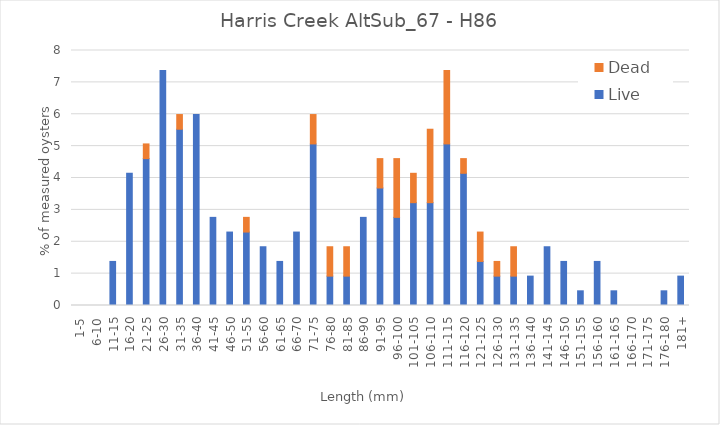
| Category | Live | Dead |
|---|---|---|
| 1-5 | 0 | 0 |
| 6-10 | 0 | 0 |
| 11-15 | 1.382 | 0 |
| 16-20 | 4.147 | 0 |
| 21-25 | 4.608 | 0.461 |
| 26-30 | 7.373 | 0 |
| 31-35 | 5.53 | 0.461 |
| 36-40 | 5.991 | 0 |
| 41-45 | 2.765 | 0 |
| 46-50 | 2.304 | 0 |
| 51-55 | 2.304 | 0.461 |
| 56-60 | 1.843 | 0 |
| 61-65 | 1.382 | 0 |
| 66-70 | 2.304 | 0 |
| 71-75 | 5.069 | 0.922 |
| 76-80 | 0.922 | 0.922 |
| 81-85 | 0.922 | 0.922 |
| 86-90 | 2.765 | 0 |
| 91-95 | 3.687 | 0.922 |
| 96-100 | 2.765 | 1.843 |
| 101-105 | 3.226 | 0.922 |
| 106-110 | 3.226 | 2.304 |
| 111-115 | 5.069 | 2.304 |
| 116-120 | 4.147 | 0.461 |
| 121-125 | 1.382 | 0.922 |
| 126-130 | 0.922 | 0.461 |
| 131-135 | 0.922 | 0.922 |
| 136-140 | 0.922 | 0 |
| 141-145 | 1.843 | 0 |
| 146-150 | 1.382 | 0 |
| 151-155 | 0.461 | 0 |
| 156-160 | 1.382 | 0 |
| 161-165 | 0.461 | 0 |
| 166-170 | 0 | 0 |
| 171-175 | 0 | 0 |
| 176-180 | 0.461 | 0 |
| 181+ | 0.922 | 0 |